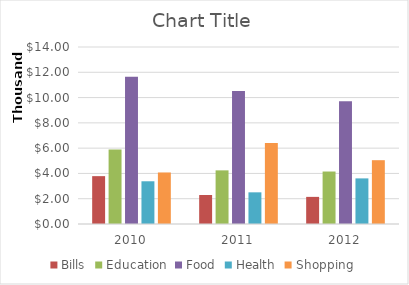
| Category | Bills | Education | Food | Health | Shopping |
|---|---|---|---|---|---|
| 2010.0 | 3785.581 | 5893.992 | 11655.463 | 3379.324 | 4075.61 |
| 2011.0 | 2291.988 | 4242.892 | 10520.331 | 2504.892 | 6415.392 |
| 2012.0 | 2145.344 | 4150.561 | 9714.334 | 3607.436 | 5046.717 |